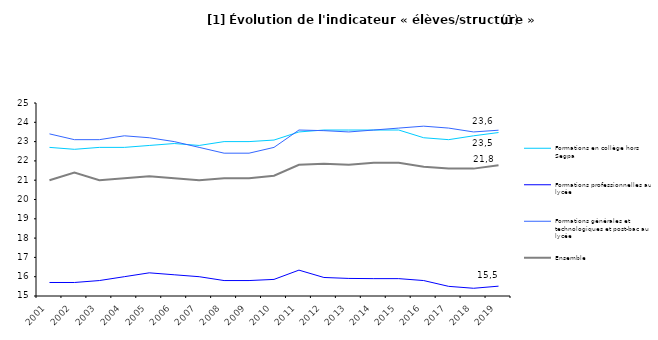
| Category | Formations en collège hors Segpa | Formations professionnelles au lycée | Formations générales et technologiques et post-bac au lycée | Ensemble |
|---|---|---|---|---|
| 2001.0 | 22.7 | 15.7 | 23.4 | 21 |
| 2002.0 | 22.6 | 15.7 | 23.1 | 21.4 |
| 2003.0 | 22.7 | 15.8 | 23.1 | 21 |
| 2004.0 | 22.7 | 16 | 23.3 | 21.1 |
| 2005.0 | 22.8 | 16.2 | 23.2 | 21.2 |
| 2006.0 | 22.9 | 16.1 | 23 | 21.1 |
| 2007.0 | 22.8 | 16 | 22.7 | 21 |
| 2008.0 | 23 | 15.8 | 22.4 | 21.1 |
| 2009.0 | 23 | 15.8 | 22.4 | 21.1 |
| 2010.0 | 23.08 | 15.86 | 22.7 | 21.23 |
| 2011.0 | 23.5 | 16.34 | 23.6 | 21.8 |
| 2012.0 | 23.6 | 15.96 | 23.567 | 21.85 |
| 2013.0 | 23.6 | 15.91 | 23.5 | 21.8 |
| 2014.0 | 23.6 | 15.9 | 23.6 | 21.9 |
| 2015.0 | 23.6 | 15.9 | 23.7 | 21.9 |
| 2016.0 | 23.2 | 15.8 | 23.8 | 21.7 |
| 2017.0 | 23.1 | 15.5 | 23.7 | 21.6 |
| 2018.0 | 23.3 | 15.4 | 23.5 | 21.6 |
| 2019.0 | 23.47 | 15.51 | 23.59 | 21.78 |